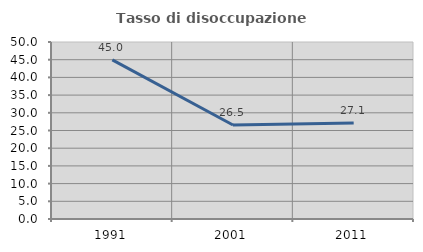
| Category | Tasso di disoccupazione giovanile  |
|---|---|
| 1991.0 | 44.964 |
| 2001.0 | 26.543 |
| 2011.0 | 27.143 |